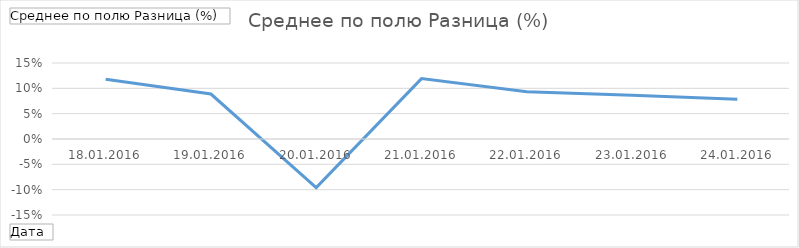
| Category | Итог |
|---|---|
| 18.01.2016 | 0.118 |
| 19.01.2016 | 0.089 |
| 20.01.2016 | -0.096 |
| 21.01.2016 | 0.119 |
| 22.01.2016 | 0.093 |
| 23.01.2016 | 0.087 |
| 24.01.2016 | 0.079 |